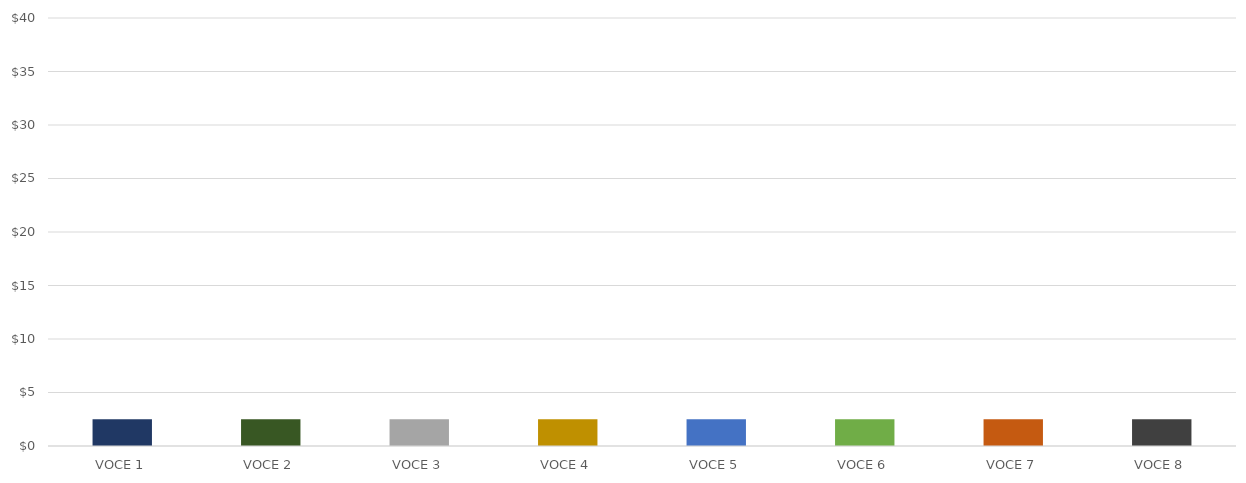
| Category | PROFITTI PER VOCE |
|---|---|
| VOCE 1 | 2.5 |
| VOCE 2 | 2.5 |
| VOCE 3 | 2.5 |
| VOCE 4 | 2.5 |
| VOCE 5 | 2.5 |
| VOCE 6 | 2.5 |
| VOCE 7 | 2.5 |
| VOCE 8 | 2.5 |